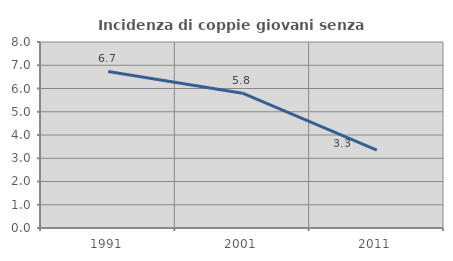
| Category | Incidenza di coppie giovani senza figli |
|---|---|
| 1991.0 | 6.732 |
| 2001.0 | 5.799 |
| 2011.0 | 3.35 |